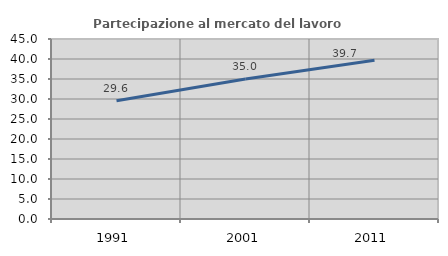
| Category | Partecipazione al mercato del lavoro  femminile |
|---|---|
| 1991.0 | 29.579 |
| 2001.0 | 34.997 |
| 2011.0 | 39.683 |